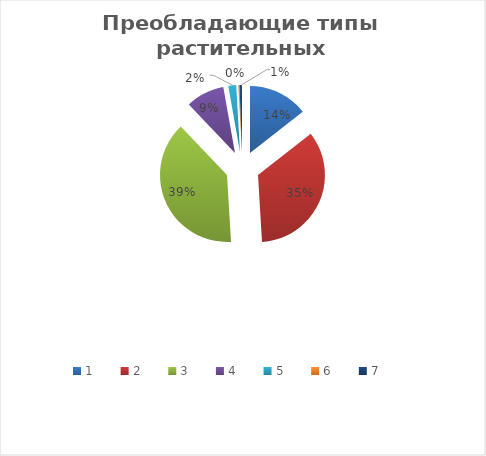
| Category | Series 0 |
|---|---|
| 0 | 14.4 |
| 1 | 34.6 |
| 2 | 38.8 |
| 3 | 9.3 |
| 4 | 1.9 |
| 5 | 0.3 |
| 6 | 0.6 |